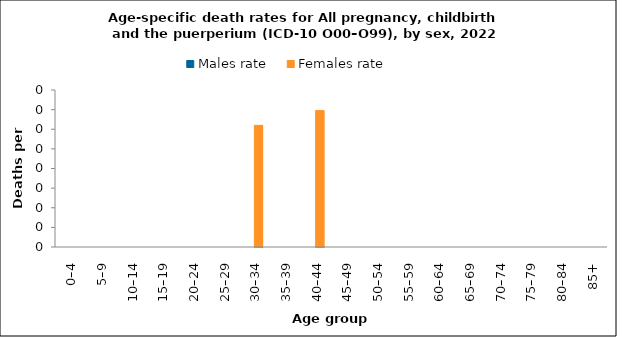
| Category | Males rate | Females rate |
|---|---|---|
| 0–4 | 0 | 0 |
| 5–9 | 0 | 0 |
| 10–14 | 0 | 0 |
| 15–19 | 0 | 0 |
| 20–24 | 0 | 0 |
| 25–29 | 0 | 0 |
| 30–34 | 0 | 0.31 |
| 35–39 | 0 | 0 |
| 40–44 | 0 | 0.348 |
| 45–49 | 0 | 0 |
| 50–54 | 0 | 0 |
| 55–59 | 0 | 0 |
| 60–64 | 0 | 0 |
| 65–69 | 0 | 0 |
| 70–74 | 0 | 0 |
| 75–79 | 0 | 0 |
| 80–84 | 0 | 0 |
| 85+ | 0 | 0 |